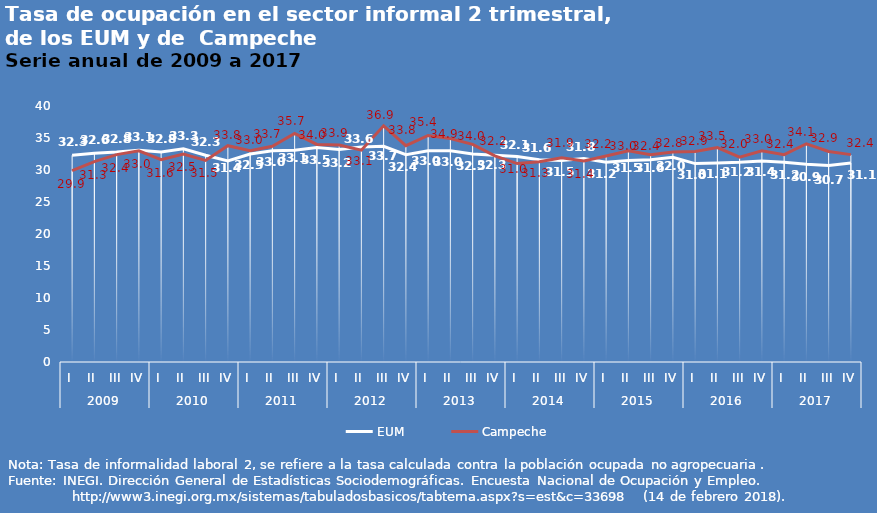
| Category | EUM | Campeche |
|---|---|---|
| 0 | 32.3 | 29.9 |
| 1 | 32.6 | 31.3 |
| 2 | 32.8 | 32.4 |
| 3 | 33.1 | 33 |
| 4 | 32.8 | 31.6 |
| 5 | 33.3 | 32.5 |
| 6 | 32.3 | 31.5 |
| 7 | 31.4 | 33.8 |
| 8 | 32.5 | 33 |
| 9 | 33 | 33.7 |
| 10 | 33.1 | 35.7 |
| 11 | 33.5 | 34 |
| 12 | 33.2 | 33.9 |
| 13 | 33.6 | 33.1 |
| 14 | 33.7 | 36.9 |
| 15 | 32.4 | 33.8 |
| 16 | 33 | 35.4 |
| 17 | 33 | 34.9 |
| 18 | 32.5 | 34 |
| 19 | 32.3 | 32.2 |
| 20 | 32.1 | 31 |
| 21 | 31.6 | 31.3 |
| 22 | 31.5 | 31.9 |
| 23 | 31.8 | 31.4 |
| 24 | 31.2 | 32.2 |
| 25 | 31.5 | 33 |
| 26 | 31.6 | 32.4 |
| 27 | 32 | 32.8 |
| 28 | 31 | 32.9 |
| 29 | 31.1 | 33.5 |
| 30 | 31.2 | 32 |
| 31 | 31.4 | 33 |
| 32 | 31.2 | 32.4 |
| 33 | 30.9 | 34.1 |
| 34 | 30.7 | 32.9 |
| 35 | 31.1 | 32.4 |